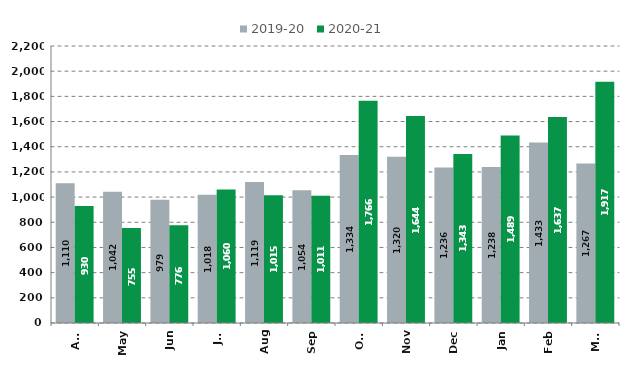
| Category | 2019-20 | 2020-21 |
|---|---|---|
| Apr | 1110 | 930 |
| May | 1042 | 755 |
| Jun | 979 | 776 |
| Jul | 1018 | 1060 |
| Aug | 1119 | 1015 |
| Sep | 1054 | 1011 |
| Oct | 1334 | 1766 |
| Nov | 1320 | 1644 |
| Dec | 1236 | 1343 |
| Jan | 1238 | 1489 |
| Feb | 1433 | 1637 |
| Mar | 1267 | 1917 |